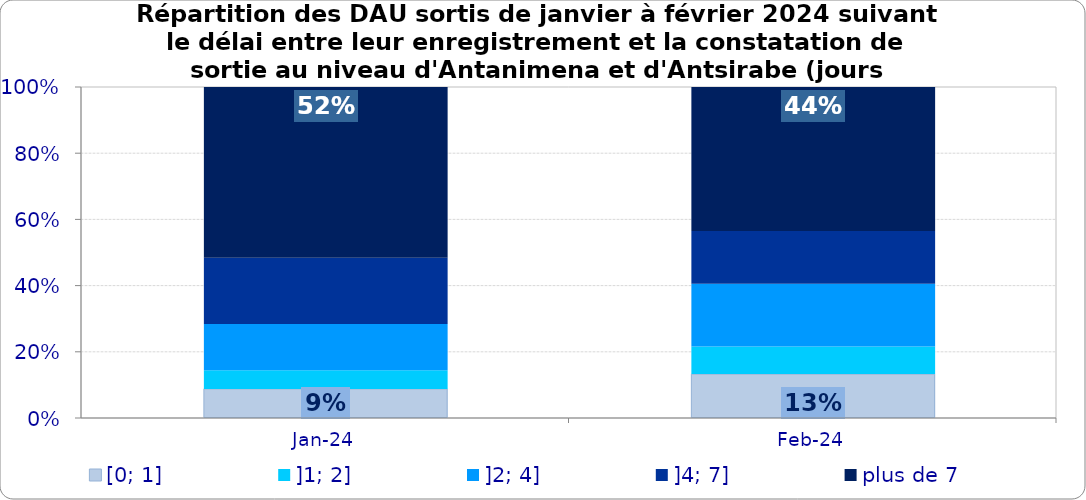
| Category | [0; 1] | ]1; 2] | ]2; 4] | ]4; 7] | plus de 7 |
|---|---|---|---|---|---|
| 2024-01-01 | 0.088 | 0.056 | 0.14 | 0.2 | 0.516 |
| 2024-02-01 | 0.133 | 0.083 | 0.19 | 0.159 | 0.435 |